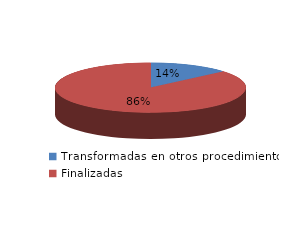
| Category | Series 0 |
|---|---|
| Transformadas en otros procedimientos | 1742 |
| Finalizadas | 11024 |